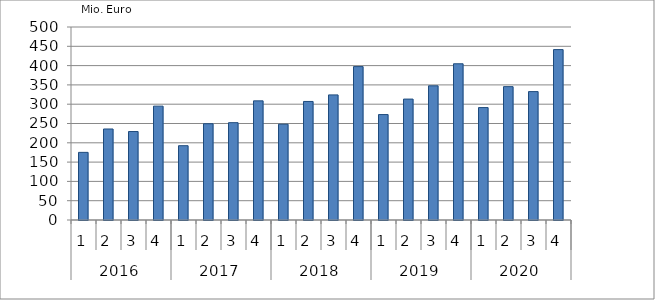
| Category | Ausbaugewerblicher Umsatz3 |
|---|---|
| 0 | 175225.59 |
| 1 | 235781.631 |
| 2 | 229227.559 |
| 3 | 294992.157 |
| 4 | 192499.539 |
| 5 | 249394.388 |
| 6 | 252146.755 |
| 7 | 308653.153 |
| 8 | 248133.418 |
| 9 | 307099.899 |
| 10 | 324088.989 |
| 11 | 397377.201 |
| 12 | 273159.137 |
| 13 | 313254.251 |
| 14 | 347631.281 |
| 15 | 404721.054 |
| 16 | 291272.144 |
| 17 | 345494.215 |
| 18 | 332629.265 |
| 19 | 441463.36 |